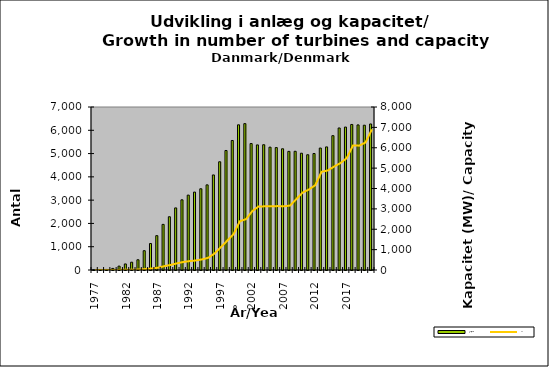
| Category | Antal/No |
|---|---|
| 1977.0 | 2 |
| 1978.0 | 13 |
| 1979.0 | 23 |
| 1980.0 | 68 |
| 1981.0 | 166 |
| 1982.0 | 260 |
| 1983.0 | 335 |
| 1984.0 | 440 |
| 1985.0 | 829 |
| 1986.0 | 1137 |
| 1987.0 | 1475 |
| 1988.0 | 1959 |
| 1989.0 | 2287 |
| 1990.0 | 2666 |
| 1991.0 | 3014 |
| 1992.0 | 3216 |
| 1993.0 | 3345 |
| 1994.0 | 3488 |
| 1995.0 | 3656 |
| 1996.0 | 4082 |
| 1997.0 | 4648 |
| 1998.0 | 5132 |
| 1999.0 | 5562 |
| 2000.0 | 6235 |
| 2001.0 | 6286 |
| 2002.0 | 5431 |
| 2003.0 | 5372 |
| 2004.0 | 5380 |
| 2005.0 | 5275 |
| 2006.0 | 5257 |
| 2007.0 | 5206 |
| 2008.0 | 5094 |
| 2009.0 | 5098 |
| 2010.0 | 5015 |
| 2011.0 | 4950 |
| 2012.0 | 5002 |
| 2013.0 | 5237 |
| 2014.0 | 5286 |
| 2015.0 | 5769 |
| 2016.0 | 6099 |
| 2017.0 | 6138 |
| 2018.0 | 6250 |
| 2019.0 | 6231 |
| 2020.0 | 6217 |
| 2021.0 | 6271 |